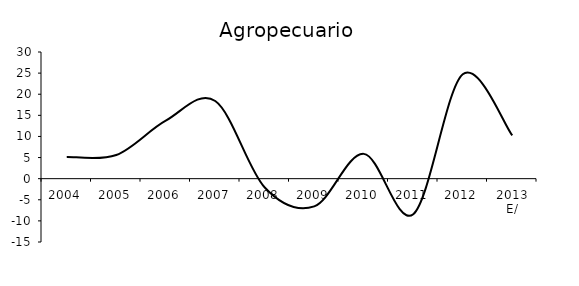
| Category | Agricultura, cría y explotación de animales, aprovechamiento forestal, pesca y caza |
|---|---|
| 2004 | 5.158 |
| 2005 | 5.603 |
| 2006 | 13.745 |
| 2007 | 18.388 |
| 2008 | -2.081 |
| 2009 | -6.557 |
| 2010 | 5.872 |
| 2011 | -8.415 |
| 2012 | 24.751 |
| 2013 E/ | 10.239 |